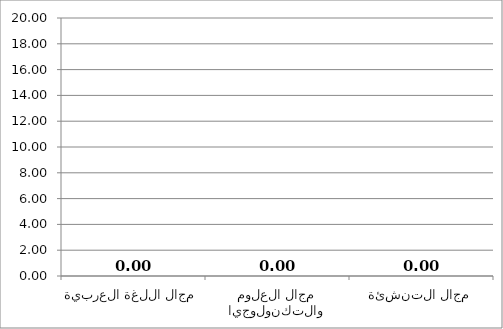
| Category | Series 0 |
|---|---|
| مجال اللغة العربية | 0 |
| مجال العلوم والتكنولوجيا | 0 |
| مجال التنشئة | 0 |